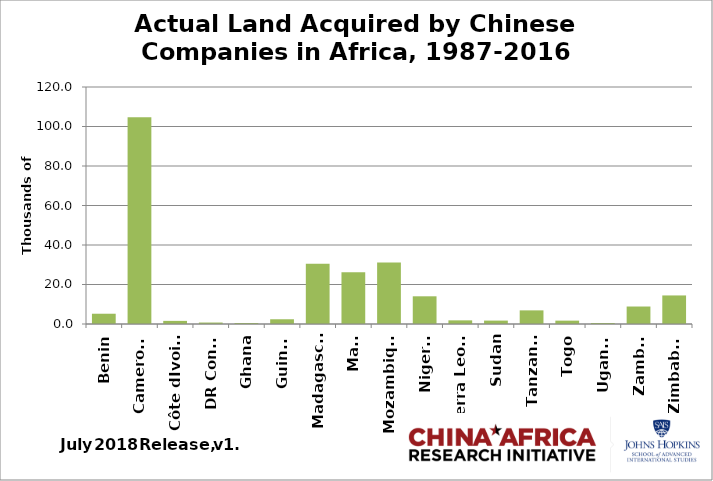
| Category | Series 0 |
|---|---|
| Benin | 5.2 |
| Cameroon | 104.655 |
| Côte dIvoire | 1.58 |
| DR Congo | 0.74 |
| Ghana | 0.5 |
| Guinea | 2.4 |
| Madagascar | 30.47 |
| Mali | 26.174 |
| Mozambique | 31.174 |
| Nigeria | 14.025 |
| Sierra Leone | 1.845 |
| Sudan | 1.727 |
| Tanzania | 6.9 |
| Togo | 1.7 |
| Uganda | 0.495 |
| Zambia | 8.852 |
| Zimbabwe | 14.463 |